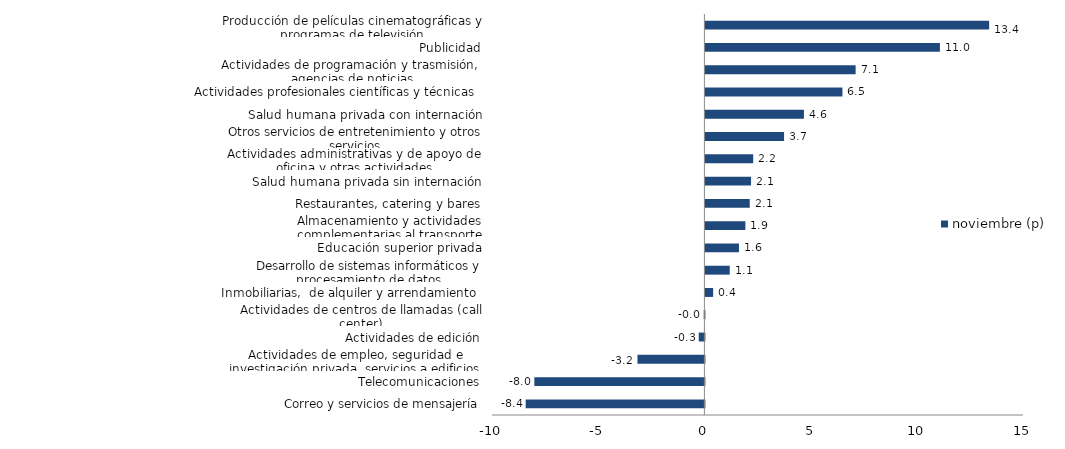
| Category | noviembre (p) |
|---|---|
| Correo y servicios de mensajería | -8.415 |
| Telecomunicaciones | -8.007 |
| Actividades de empleo, seguridad e investigación privada, servicios a edificios | -3.151 |
| Actividades de edición | -0.266 |
| Actividades de centros de llamadas (call center) | -0.031 |
| Inmobiliarias,  de alquiler y arrendamiento  | 0.364 |
| Desarrollo de sistemas informáticos y procesamiento de datos | 1.146 |
| Educación superior privada | 1.581 |
| Almacenamiento y actividades complementarias al transporte | 1.882 |
| Restaurantes, catering y bares | 2.088 |
| Salud humana privada sin internación | 2.149 |
| Actividades administrativas y de apoyo de oficina y otras actividades | 2.25 |
| Otros servicios de entretenimiento y otros servicios | 3.704 |
| Salud humana privada con internación | 4.64 |
| Actividades profesionales científicas y técnicas  | 6.452 |
| Actividades de programación y trasmisión,  agencias de noticias | 7.073 |
| Publicidad | 11.042 |
| Producción de películas cinematográficas y programas de televisión | 13.359 |